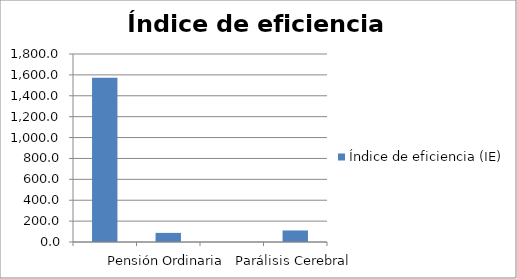
| Category | Índice de eficiencia (IE)  |
|---|---|
|  | 1573.064 |
| Pensión Ordinaria | 87.231 |
|  | 0 |
| Parálisis Cerebral | 110.424 |